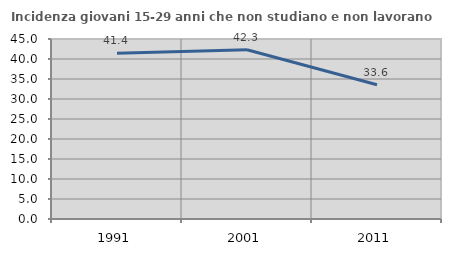
| Category | Incidenza giovani 15-29 anni che non studiano e non lavorano  |
|---|---|
| 1991.0 | 41.41 |
| 2001.0 | 42.313 |
| 2011.0 | 33.556 |